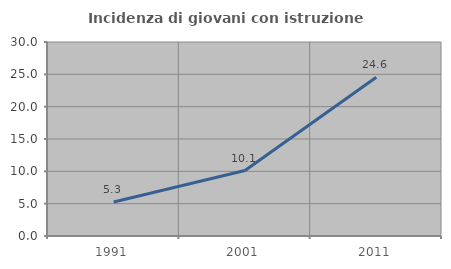
| Category | Incidenza di giovani con istruzione universitaria |
|---|---|
| 1991.0 | 5.263 |
| 2001.0 | 10.127 |
| 2011.0 | 24.561 |